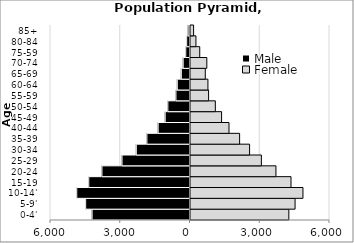
| Category | Male | Female |
|---|---|---|
| 0-4' | -4211.17 | 4229.4 |
| 5-9' | -4487.86 | 4497.78 |
| 10-14' | -4871.02 | 4836.92 |
| 15-19 | -4353.6 | 4323.19 |
| 20-24 | -3787.4 | 3674.16 |
| 25-29 | -2923.59 | 3048.5 |
| 30-34 | -2309.16 | 2541.3 |
| 35-39 | -1853.92 | 2112.27 |
| 40-44 | -1370.15 | 1655.3 |
| 45-49 | -1067.57 | 1337.32 |
| 50-54 | -952.92 | 1068.24 |
| 55-59 | -604.55 | 777.58 |
| 60-64 | -546.45 | 749.69 |
| 65-69 | -373.48 | 636.36 |
| 70-74 | -293.43 | 701.85 |
| 75-59 | -182.5 | 397.76 |
| 80-84 | -142.61 | 233.47 |
| 85+ | -81.14 | 133.73 |